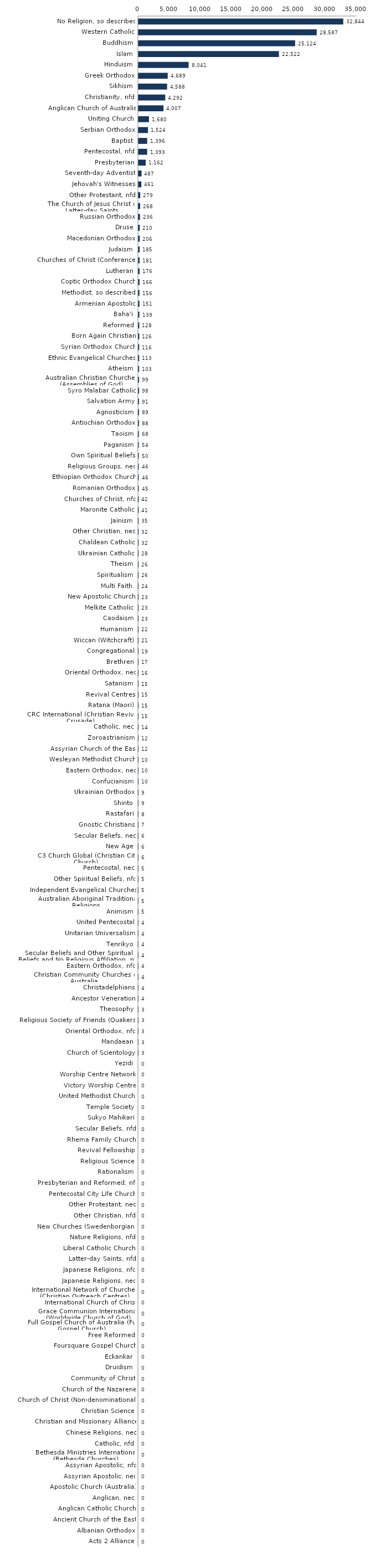
| Category | Series 0 |
|---|---|
| No Religion, so described | 32844 |
| Western Catholic | 28587 |
| Buddhism | 25124 |
| Islam | 22522 |
| Hinduism | 8041 |
| Greek Orthodox | 4689 |
| Sikhism | 4588 |
| Christianity, nfd | 4292 |
| Anglican Church of Australia | 4007 |
| Uniting Church | 1680 |
| Serbian Orthodox | 1524 |
| Baptist | 1396 |
| Pentecostal, nfd | 1393 |
| Presbyterian | 1162 |
| Seventh-day Adventist | 487 |
| Jehovah's Witnesses | 461 |
| Other Protestant, nfd | 279 |
| The Church of Jesus Christ of Latter-day Saints | 268 |
| Russian Orthodox | 236 |
| Druse | 210 |
| Macedonian Orthodox | 206 |
| Judaism | 185 |
| Churches of Christ (Conference) | 181 |
| Lutheran | 176 |
| Coptic Orthodox Church | 166 |
| Methodist, so described | 156 |
| Armenian Apostolic | 151 |
| Baha'i | 139 |
| Reformed | 128 |
| Born Again Christian | 126 |
| Syrian Orthodox Church | 116 |
| Ethnic Evangelical Churches | 113 |
| Atheism | 103 |
| Australian Christian Churches (Assemblies of God) | 99 |
| Syro Malabar Catholic | 98 |
| Salvation Army | 91 |
| Agnosticism | 89 |
| Antiochian Orthodox | 88 |
| Taoism | 68 |
| Paganism | 54 |
| Own Spiritual Beliefs | 50 |
| Religious Groups, nec | 46 |
| Ethiopian Orthodox Church | 46 |
| Romanian Orthodox | 45 |
| Churches of Christ, nfd | 42 |
| Maronite Catholic | 41 |
| Jainism | 35 |
| Other Christian, nec | 32 |
| Chaldean Catholic | 32 |
| Ukrainian Catholic | 28 |
| Theism | 26 |
| Spiritualism | 26 |
| Multi Faith | 24 |
| New Apostolic Church | 23 |
| Melkite Catholic | 23 |
| Caodaism | 23 |
| Humanism | 22 |
| Wiccan (Witchcraft) | 21 |
| Congregational | 19 |
| Brethren | 17 |
| Oriental Orthodox, nec | 16 |
| Satanism | 15 |
| Revival Centres | 15 |
| Ratana (Maori) | 15 |
| CRC International (Christian Revival Crusade) | 15 |
| Catholic, nec | 14 |
| Zoroastrianism | 12 |
| Assyrian Church of the East | 12 |
| Wesleyan Methodist Church | 10 |
| Eastern Orthodox, nec | 10 |
| Confucianism | 10 |
| Ukrainian Orthodox | 9 |
| Shinto | 9 |
| Rastafari | 8 |
| Gnostic Christians | 7 |
| Secular Beliefs, nec | 6 |
| New Age | 6 |
| C3 Church Global (Christian City Church) | 6 |
| Pentecostal, nec | 5 |
| Other Spiritual Beliefs, nfd | 5 |
| Independent Evangelical Churches | 5 |
| Australian Aboriginal Traditional Religions | 5 |
| Animism | 5 |
| United Pentecostal | 4 |
| Unitarian Universalism | 4 |
| Tenrikyo | 4 |
| Secular Beliefs and Other Spiritual Beliefs and No Religious Affiliation, nfd | 4 |
| Eastern Orthodox, nfd | 4 |
| Christian Community Churches of Australia | 4 |
| Christadelphians | 4 |
| Ancestor Veneration | 4 |
| Theosophy | 3 |
| Religious Society of Friends (Quakers) | 3 |
| Oriental Orthodox, nfd | 3 |
| Mandaean | 3 |
| Church of Scientology | 3 |
| Yezidi | 0 |
| Worship Centre Network | 0 |
| Victory Worship Centre | 0 |
| United Methodist Church | 0 |
| Temple Society | 0 |
| Sukyo Mahikari | 0 |
| Secular Beliefs, nfd | 0 |
| Rhema Family Church | 0 |
| Revival Fellowship | 0 |
| Religious Science | 0 |
| Rationalism | 0 |
| Presbyterian and Reformed, nfd | 0 |
| Pentecostal City Life Church | 0 |
| Other Protestant, nec | 0 |
| Other Christian, nfd | 0 |
| New Churches (Swedenborgian) | 0 |
| Nature Religions, nfd | 0 |
| Liberal Catholic Church | 0 |
| Latter-day Saints, nfd | 0 |
| Japanese Religions, nfd | 0 |
| Japanese Religions, nec | 0 |
| International Network of Churches (Christian Outreach Centres) | 0 |
| International Church of Christ | 0 |
| Grace Communion International (Worldwide Church of God) | 0 |
| Full Gospel Church of Australia (Full Gospel Church) | 0 |
| Free Reformed | 0 |
| Foursquare Gospel Church | 0 |
| Eckankar | 0 |
| Druidism | 0 |
| Community of Christ | 0 |
| Church of the Nazarene | 0 |
| Church of Christ (Non-denominational) | 0 |
| Christian Science | 0 |
| Christian and Missionary Alliance | 0 |
| Chinese Religions, nec | 0 |
| Catholic, nfd | 0 |
| Bethesda Ministries International (Bethesda Churches) | 0 |
| Assyrian Apostolic, nfd | 0 |
| Assyrian Apostolic, nec | 0 |
| Apostolic Church (Australia) | 0 |
| Anglican, nec | 0 |
| Anglican Catholic Church | 0 |
| Ancient Church of the East | 0 |
| Albanian Orthodox | 0 |
| Acts 2 Alliance | 0 |